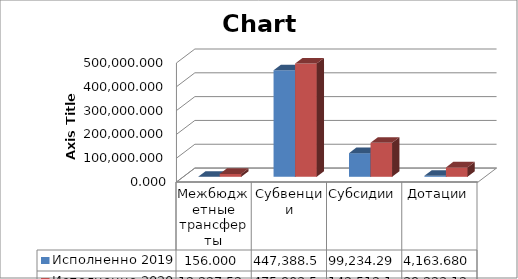
| Category | Исполненно 2019 | Исполненно 2020 |
|---|---|---|
| Межбюджетные трансферты | 156 | 12227.525 |
| Субвенции | 447388.51 | 475903.538 |
| Субсидии | 99234.29 | 142512.159 |
| Дотации | 4163.68 | 39223.121 |